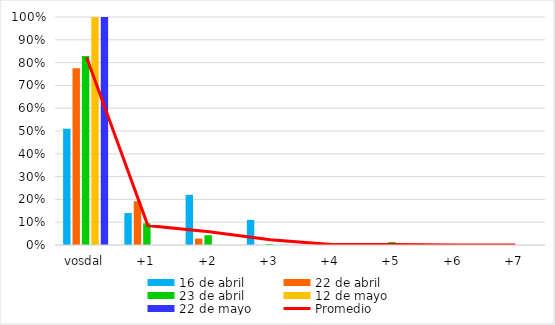
| Category | 16 de abril | 22 de abril | 23 de abril | 12 de mayo | 22 de mayo |
|---|---|---|---|---|---|
| vosdal | 0.51 | 0.775 | 0.829 | 1 | 1 |
| +1 | 0.14 | 0.192 | 0.095 | 0 | 0 |
| +2 | 0.22 | 0.028 | 0.043 | 0 | 0 |
| +3 | 0.11 | 0 | 0.004 | 0 | 0 |
| +4 | 0 | 0 | 0.009 | 0 | 0 |
| +5 | 0 | 0 | 0.013 | 0 | 0 |
| +6 | 0 | 0 | 0 | 0 | 0 |
| +7 | 0 | 0 | 0 | 0 | 0 |